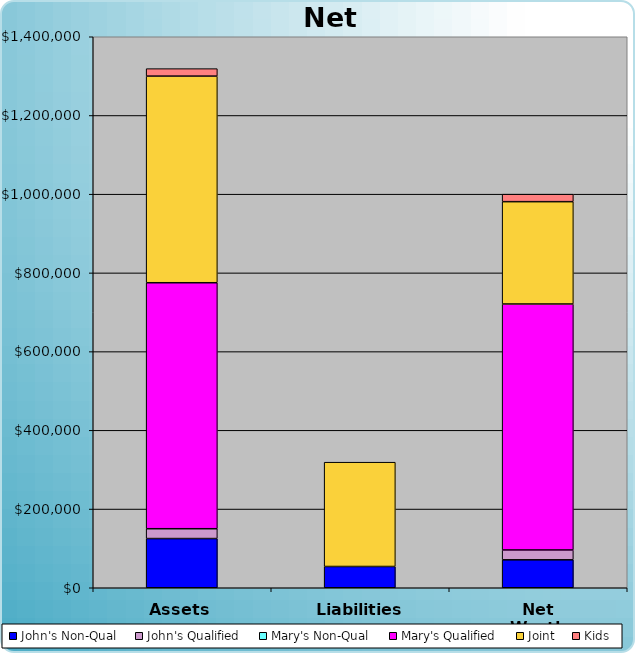
| Category | John's Non-Qual | John's Qualified | Mary's Non-Qual | Mary's Qualified | Joint | Kids |
|---|---|---|---|---|---|---|
| Assets | 125000 | 25000 | 0 | 625000 | 525000 | 19000 |
| Liabilities | 54000 | 0 | 0 | 0 | 265000 | 0 |
| Net Worth | 71000 | 25000 | 0 | 625000 | 260000 | 19000 |